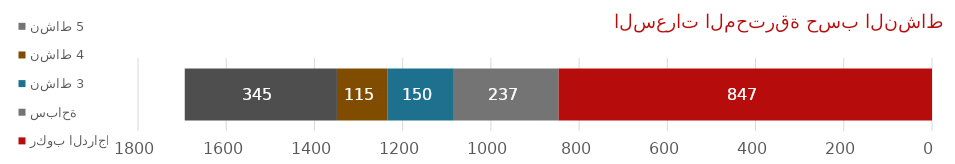
| Category | ركوب الدراجات | سباحة | نشاط 3 | نشاط 4 | نشاط 5 |
|---|---|---|---|---|---|
| أداة تعقب النشاط | 847 | 237 | 150 | 115 | 345 |